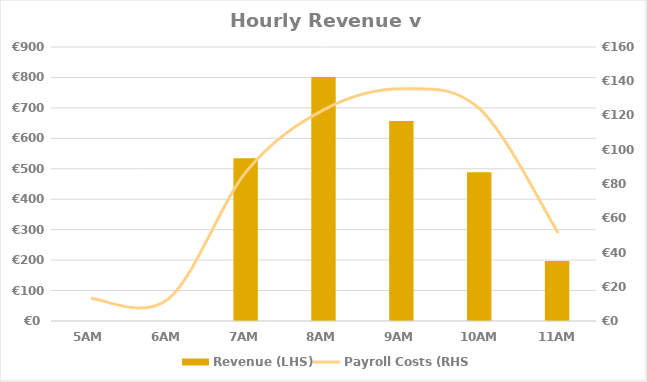
| Category | Revenue (LHS) |
|---|---|
| 5AM | 0 |
| 6AM | 0 |
| 7AM | 534.4 |
| 8AM | 801.8 |
| 9AM | 656.8 |
| 10AM | 489 |
| 11AM | 197.25 |